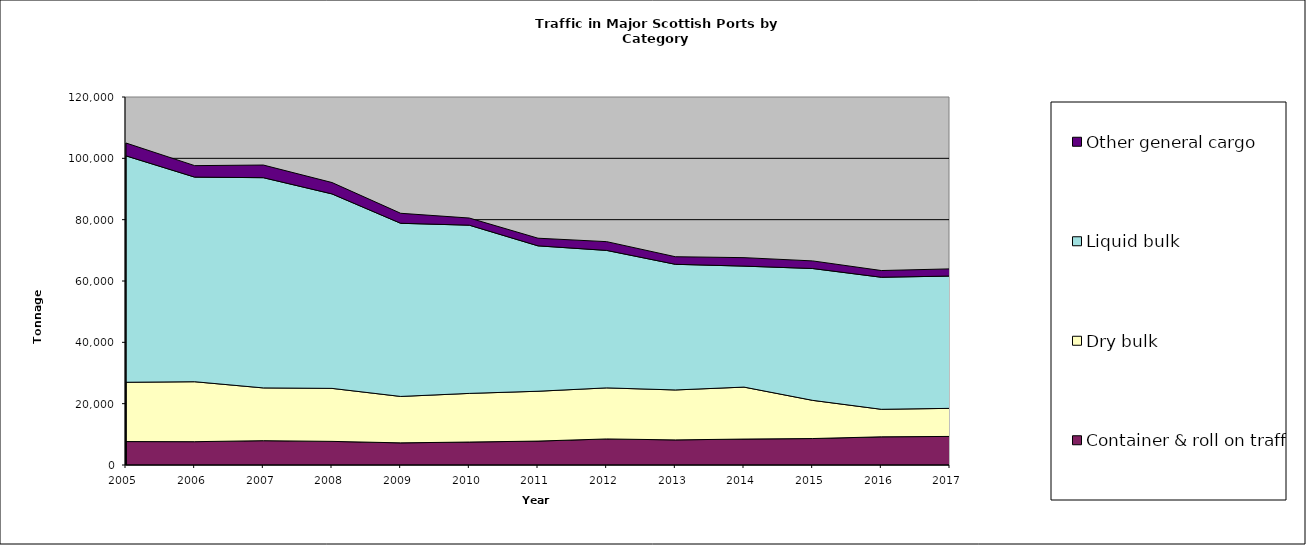
| Category | Container & roll on traffic | Dry bulk | Liquid bulk | Other general cargo |
|---|---|---|---|---|
| 2005.0 | 7639 | 19339 | 73828 | 4190 |
| 2006.0 | 7604 | 19548 | 66724 | 3744 |
| 2007.0 | 7932 | 17207 | 68553 | 4121 |
| 2008.0 | 7700 | 17283 | 63416 | 3709 |
| 2009.0 | 7217 | 15140 | 56462 | 3262 |
| 2010.0 | 7487 | 15862 | 54848 | 2332 |
| 2011.0 | 7799 | 16253 | 47410 | 2489 |
| 2012.0 | 8494 | 16651 | 44829 | 2859 |
| 2013.0 | 8186 | 16283 | 40973 | 2475 |
| 2014.0 | 8456 | 16944 | 39455 | 2761 |
| 2015.0 | 8630.139 | 12446 | 42993 | 2483 |
| 2016.0 | 9191 | 8973 | 43058 | 2187 |
| 2017.0 | 9318 | 9152 | 43142 | 2341 |